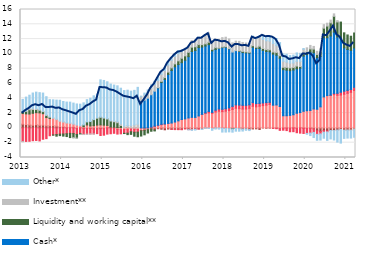
| Category | Transaction accounts | Housing | Consumer | Cash* | Liquidity and working capital** | Investment** | Other* |
|---|---|---|---|---|---|---|---|
| 2013-01-01 | 0.508 | 1.431 | -1.847 | 0 | 0.247 | -0.025 | 1.661 |
| 2013-02-01 | 0.453 | 1.445 | -1.828 | 0 | 0.347 | 0.059 | 1.858 |
| 2013-03-01 | 0.396 | 1.481 | -1.809 | 0 | 0.577 | 0.174 | 1.791 |
| 2013-04-01 | 0.363 | 1.611 | -1.729 | 0 | 0.524 | 0.158 | 2.057 |
| 2013-05-01 | 0.428 | 1.629 | -1.697 | 0 | 0.421 | 0.119 | 2.236 |
| 2013-06-01 | 0.354 | 1.679 | -1.76 | 0 | 0.356 | 0.073 | 2.298 |
| 2013-07-01 | 0.377 | 1.547 | -1.534 | 0 | 0.28 | 0.055 | 2.445 |
| 2013-08-01 | 0.277 | 1.122 | -1.451 | 0 | 0.273 | 0.107 | 2.436 |
| 2013-09-01 | 0.283 | 0.981 | -1.058 | 0 | 0.173 | 0.116 | 2.267 |
| 2013-10-01 | 0.296 | 0.993 | -0.949 | 0 | -0.033 | 0.081 | 2.425 |
| 2013-11-01 | 0.234 | 0.883 | -0.898 | 0 | -0.218 | 0.069 | 2.571 |
| 2013-12-01 | 0.178 | 0.692 | -0.843 | 0 | -0.202 | 0.115 | 2.751 |
| 2014-01-01 | 0.161 | 0.59 | -0.827 | 0 | -0.283 | 0.112 | 2.704 |
| 2014-02-01 | 0.047 | 0.58 | -0.791 | 0 | -0.379 | 0.1 | 2.763 |
| 2014-03-01 | 0.093 | 0.545 | -0.742 | 0 | -0.569 | 0.016 | 2.827 |
| 2014-04-01 | 0.086 | 0.425 | -0.769 | 0 | -0.554 | -0.011 | 2.841 |
| 2014-05-01 | -0.103 | 0.39 | -0.777 | 0 | -0.503 | -0.016 | 2.846 |
| 2014-06-01 | 0.02 | 0.27 | -0.77 | 0 | -0.102 | -0.004 | 2.917 |
| 2014-07-01 | -0.1 | 0.167 | -0.769 | 0 | 0.237 | -0.031 | 2.979 |
| 2014-08-01 | -0.098 | 0.395 | -0.748 | 0 | 0.414 | -0.032 | 3.01 |
| 2014-09-01 | -0.081 | 0.267 | -0.729 | 0 | 0.594 | -0.055 | 3.145 |
| 2014-10-01 | -0.149 | 0.302 | -0.669 | 0 | 0.817 | -0.022 | 3.213 |
| 2014-11-01 | -0.14 | 0.382 | -0.636 | 0 | 0.945 | 0.036 | 3.176 |
| 2014-12-01 | -0.096 | 0.404 | -0.93 | 0 | 1.047 | 0.02 | 5.023 |
| 2015-01-01 | -0.103 | 0.371 | -0.88 | 0 | 0.971 | 0.029 | 5.041 |
| 2015-02-01 | 0.049 | 0.294 | -0.837 | 0 | 0.885 | 0.01 | 4.996 |
| 2015-03-01 | 0.079 | 0.039 | -0.79 | 0 | 0.818 | 0.043 | 4.945 |
| 2015-04-01 | 0.097 | -0.029 | -0.7 | 0 | 0.733 | 0.112 | 4.846 |
| 2015-05-01 | 0.037 | -0.211 | -0.623 | 0 | 0.663 | 0.156 | 4.828 |
| 2015-06-01 | 0.048 | -0.237 | -0.564 | 0 | 0.273 | 0.217 | 4.827 |
| 2015-07-01 | 0.011 | -0.222 | -0.512 | 0 | -0.03 | 0.258 | 4.777 |
| 2015-08-01 | 0.06 | -0.235 | -0.472 | 0 | -0.202 | 0.254 | 4.784 |
| 2015-09-01 | -0.027 | -0.077 | -0.415 | 0 | -0.356 | 0.321 | 4.643 |
| 2015-10-01 | -0.034 | -0.17 | -0.385 | 0 | -0.533 | 0.409 | 4.662 |
| 2015-11-01 | 0.008 | -0.216 | -0.356 | 0 | -0.624 | 0.491 | 4.982 |
| 2015-12-01 | -0.089 | -0.265 | -0.024 | 3.632 | -0.722 | 0.632 | 0.016 |
| 2016-01-01 | -0.127 | -0.175 | -0.021 | 3.762 | -0.611 | 0.682 | 0.257 |
| 2016-02-01 | -0.043 | -0.189 | 0.001 | 4.013 | -0.457 | 0.748 | 0.372 |
| 2016-03-01 | -0.152 | 0.065 | 0.042 | 4.376 | -0.299 | 0.899 | 0.433 |
| 2016-04-01 | -0.291 | 0.194 | 0.05 | 4.714 | -0.12 | 0.918 | 0.433 |
| 2016-05-01 | -0.108 | 0.303 | 0.059 | 5.046 | 0.031 | 0.954 | 0.425 |
| 2016-06-01 | -0.176 | 0.432 | 0.056 | 5.656 | 0.139 | 0.962 | 0.437 |
| 2016-07-01 | -0.255 | 0.503 | 0.03 | 6.024 | 0.239 | 0.947 | 0.404 |
| 2016-08-01 | -0.154 | 0.606 | 0.004 | 6.623 | 0.307 | 0.957 | 0.426 |
| 2016-09-01 | -0.178 | 0.661 | -0.02 | 7.102 | 0.348 | 1.031 | 0.396 |
| 2016-10-01 | -0.176 | 0.793 | -0.055 | 7.461 | 0.394 | 1.006 | 0.414 |
| 2016-11-01 | -0.174 | 0.952 | -0.065 | 7.609 | 0.499 | 0.969 | 0.433 |
| 2016-12-01 | -0.201 | 1.131 | -0.045 | 7.685 | 0.596 | 0.886 | 0.263 |
| 2017-01-01 | -0.106 | 1.22 | -0.024 | 7.92 | 0.595 | 0.87 | 0.053 |
| 2017-02-01 | -0.207 | 1.343 | -0.03 | 8.279 | 0.584 | 0.861 | -0.029 |
| 2017-03-01 | -0.208 | 1.424 | -0.041 | 8.897 | 0.588 | 0.894 | -0.087 |
| 2017-04-01 | -0.152 | 1.419 | -0.038 | 9.037 | 0.509 | 0.925 | -0.101 |
| 2017-05-01 | -0.139 | 1.617 | -0.009 | 9.239 | 0.4 | 0.979 | 0.036 |
| 2017-06-01 | -0.149 | 1.807 | 0.026 | 9.09 | 0.33 | 1.082 | -0.071 |
| 2017-07-01 | -0.013 | 1.938 | 0.095 | 9.039 | 0.286 | 1.153 | -0.047 |
| 2017-08-01 | -0.026 | 2.037 | 0.187 | 9.028 | 0.319 | 1.239 | -0.048 |
| 2017-09-01 | -0.096 | 1.953 | 0.144 | 8.311 | 0.208 | 1.123 | -0.228 |
| 2017-10-01 | -0.014 | 2.157 | 0.238 | 8.209 | 0.241 | 1.163 | -0.142 |
| 2017-11-01 | -0.023 | 2.254 | 0.303 | 8.195 | 0.045 | 1.16 | -0.142 |
| 2017-12-01 | -0.056 | 2.205 | 0.311 | 8.33 | 0.09 | 1.26 | -0.508 |
| 2018-01-01 | -0.081 | 2.265 | 0.327 | 8.3 | 0.083 | 1.278 | -0.481 |
| 2018-02-01 | -0.113 | 2.34 | 0.369 | 7.965 | 0.047 | 1.301 | -0.424 |
| 2018-03-01 | -0.111 | 2.495 | 0.416 | 7.335 | -0.033 | 1.25 | -0.433 |
| 2018-04-01 | -0.081 | 2.649 | 0.463 | 7.33 | -0.002 | 1.282 | -0.359 |
| 2018-05-01 | -0.115 | 2.601 | 0.491 | 7.248 | 0.078 | 1.279 | -0.329 |
| 2018-06-01 | -0.166 | 2.547 | 0.505 | 7.138 | 0.143 | 1.197 | -0.261 |
| 2018-07-01 | -0.145 | 2.554 | 0.495 | 7.101 | 0.124 | 1.2 | -0.178 |
| 2018-08-01 | -0.225 | 2.647 | 0.474 | 6.992 | 0.092 | 1.178 | -0.137 |
| 2018-09-01 | -0.14 | 2.915 | 0.498 | 7.489 | 0.205 | 1.226 | 0.07 |
| 2018-10-01 | -0.125 | 2.846 | 0.442 | 7.456 | 0.158 | 1.193 | 0.104 |
| 2018-11-01 | -0.206 | 2.929 | 0.385 | 7.416 | 0.306 | 1.244 | 0.165 |
| 2018-12-01 | -0.005 | 3.009 | 0.366 | 7.096 | 0.257 | 1.224 | 0.559 |
| 2019-01-01 | -0.045 | 3.078 | 0.343 | 6.898 | 0.267 | 1.186 | 0.594 |
| 2019-02-01 | -0.024 | 3.175 | 0.284 | 6.823 | 0.273 | 1.178 | 0.658 |
| 2019-03-01 | -0.041 | 3.067 | -0.017 | 6.909 | 0.281 | 1.148 | 0.909 |
| 2019-04-01 | -0.041 | 3.102 | -0.071 | 6.728 | 0.35 | 0.959 | 0.944 |
| 2019-05-01 | -0.101 | 2.892 | -0.229 | 6.532 | 0.332 | 0.851 | 0.917 |
| 2019-06-01 | -0.032 | 1.641 | -0.277 | 6.225 | 0.324 | 0.815 | 0.995 |
| 2019-07-01 | -0.025 | 1.64 | -0.34 | 6.167 | 0.367 | 0.718 | 1.061 |
| 2019-08-01 | -0.025 | 1.693 | -0.499 | 6.043 | 0.38 | 0.64 | 1.02 |
| 2019-09-01 | 0.002 | 1.775 | -0.51 | 6.049 | 0.332 | 0.612 | 1.07 |
| 2019-10-01 | -0.05 | 1.982 | -0.601 | 6.001 | 0.376 | 0.64 | 1.135 |
| 2019-11-01 | 0.007 | 2.063 | -0.707 | 6.01 | 0.22 | 0.687 | 1.09 |
| 2019-12-01 | -0.045 | 2.247 | -0.705 | 7.459 | 0.31 | 0.604 | 0.109 |
| 2020-01-31 | -0.067 | 2.32 | -0.682 | 7.598 | 0.358 | 0.543 | -0.107 |
| 2020-02-29 | -0.05 | 2.357 | -0.646 | 7.878 | 0.431 | 0.481 | -0.343 |
| 2020-03-31 | -0.142 | 2.559 | -0.469 | 7.592 | 0.497 | 0.362 | -0.693 |
| 2020-04-30 | -0.391 | 2.519 | -0.482 | 6.976 | 0.428 | 0.428 | -0.807 |
| 2020-05-31 | -0.497 | 2.845 | -0.315 | 6.823 | 0.636 | 0.451 | -0.835 |
| 2020-06-30 | -0.368 | 4.188 | -0.212 | 7.993 | 1.298 | 0.472 | -0.814 |
| 2020-07-31 | -0.412 | 4.363 | -0.136 | 7.827 | 1.569 | 0.389 | -1.144 |
| 2020-08-31 | -0.35 | 4.374 | 0.053 | 7.995 | 1.779 | 0.365 | -1.139 |
| 2020-09-30 | -0.363 | 4.491 | 0.175 | 8.283 | 2.132 | 0.326 | -1.274 |
| 2020-10-31 | -0.292 | 4.411 | 0.268 | 7.607 | 2.03 | 0.189 | -1.627 |
| 2020-11-30 | -0.235 | 4.434 | 0.387 | 7.362 | 2.118 | -0.01 | -1.811 |
| 2020-12-31 | -0.3 | 4.547 | 0.414 | 5.86 | 2.023 | -0.042 | -1.076 |
| 2021-01-31 | -0.28 | 4.676 | 0.397 | 5.527 | 1.958 | -0.051 | -1.044 |
| 2021-02-28 | -0.274 | 4.804 | 0.394 | 5.276 | 1.914 | -0.107 | -0.992 |
| 2021-03-31 | -0.144 | 5.051 | 0.432 | 5.319 | 2.021 | -0.132 | -0.998 |